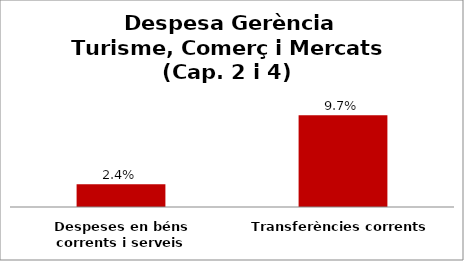
| Category | Series 0 |
|---|---|
| Despeses en béns corrents i serveis | 0.024 |
| Transferències corrents | 0.097 |